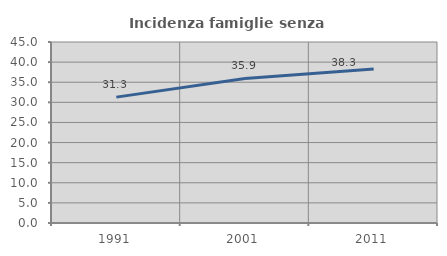
| Category | Incidenza famiglie senza nuclei |
|---|---|
| 1991.0 | 31.296 |
| 2001.0 | 35.928 |
| 2011.0 | 38.267 |